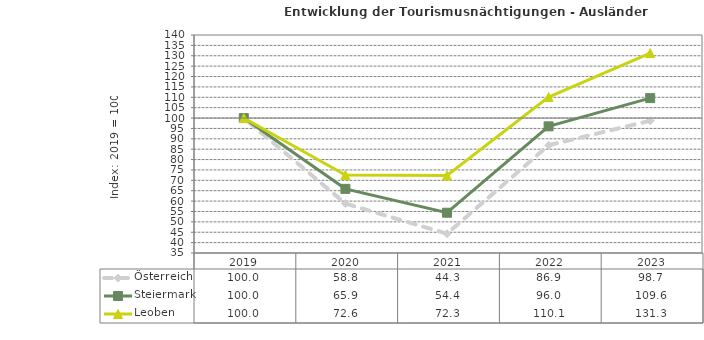
| Category | Österreich | Steiermark | Leoben |
|---|---|---|---|
| 2023.0 | 98.7 | 109.6 | 131.3 |
| 2022.0 | 86.9 | 96 | 110.1 |
| 2021.0 | 44.3 | 54.4 | 72.3 |
| 2020.0 | 58.8 | 65.9 | 72.6 |
| 2019.0 | 100 | 100 | 100 |